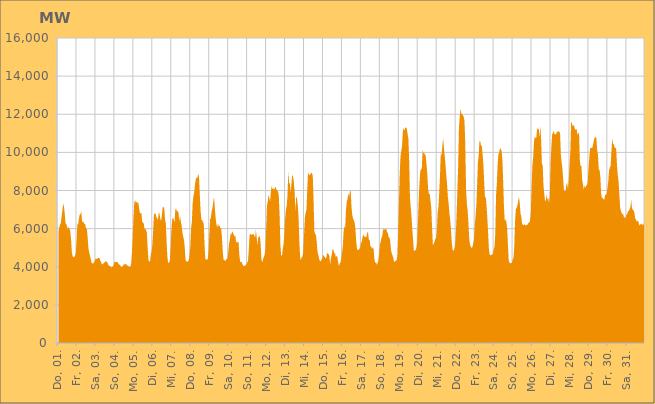
| Category | Series 0 |
|---|---|
|  Do, 01.  | 5819.141 |
|  Do, 01.  | 6049.581 |
|  Do, 01.  | 6199.943 |
|  Do, 01.  | 6284.422 |
|  Do, 01.  | 6601.119 |
|  Do, 01.  | 6928.238 |
|  Do, 01.  | 7310.073 |
|  Do, 01.  | 7171.679 |
|  Do, 01.  | 6812.417 |
|  Do, 01.  | 6271.698 |
|  Do, 01.  | 6247.18 |
|  Do, 01.  | 6112.427 |
|  Do, 01.  | 5953.786 |
|  Do, 01.  | 6097.898 |
|  Do, 01.  | 5997.28 |
|  Do, 01.  | 5862.135 |
|  Do, 01.  | 5456.843 |
|  Fr, 02.  | 4765.099 |
|  Fr, 02.  | 4569.053 |
|  Fr, 02.  | 4491.443 |
|  Fr, 02.  | 4515.205 |
|  Fr, 02.  | 4572.981 |
|  Fr, 02.  | 4697.592 |
|  Fr, 02.  | 5350.879 |
|  Fr, 02.  | 6231.528 |
|  Fr, 02.  | 6216.547 |
|  Fr, 02.  | 6530.846 |
|  Fr, 02.  | 6744.199 |
|  Fr, 02.  | 6755.091 |
|  Fr, 02.  | 6926.41 |
|  Fr, 02.  | 6336.916 |
|  Fr, 02.  | 6390.28 |
|  Fr, 02.  | 6328.69 |
|  Fr, 02.  | 6253.704 |
|  Fr, 02.  | 6226.253 |
|  Fr, 02.  | 5995.545 |
|  Fr, 02.  | 6007.529 |
|  Fr, 02.  | 5546.606 |
|  Fr, 02.  | 4977.057 |
|  Fr, 02.  | 4747.986 |
|  Fr, 02.  | 4575.123 |
|  Sa, 03.  | 4416.955 |
|  Sa, 03.  | 4207.178 |
|  Sa, 03.  | 4182.391 |
|  Sa, 03.  | 4170.869 |
|  Sa, 03.  | 4225.471 |
|  Sa, 03.  | 4305.148 |
|  Sa, 03.  | 4427.548 |
|  Sa, 03.  | 4406.7 |
|  Sa, 03.  | 4422.26 |
|  Sa, 03.  | 4448.501 |
|  Sa, 03.  | 4472.187 |
|  Sa, 03.  | 4457.336 |
|  Sa, 03.  | 4332.002 |
|  Sa, 03.  | 4228.605 |
|  Sa, 03.  | 4135.831 |
|  Sa, 03.  | 4130.716 |
|  Sa, 03.  | 4177.757 |
|  Sa, 03.  | 4219.109 |
|  Sa, 03.  | 4242.172 |
|  Sa, 03.  | 4301.738 |
|  Sa, 03.  | 4260.028 |
|  Sa, 03.  | 4221.406 |
|  Sa, 03.  | 4116.581 |
|  Sa, 03.  | 4052.291 |
|  So, 04.  | 4043.021 |
|  So, 04.  | 4012.192 |
|  So, 04.  | 3961.959 |
|  So, 04.  | 4003.036 |
|  So, 04.  | 4000.279 |
|  So, 04.  | 4105.423 |
|  So, 04.  | 4258.826 |
|  So, 04.  | 4254.578 |
|  So, 04.  | 4249.414 |
|  So, 04.  | 4243.981 |
|  So, 04.  | 4236.702 |
|  So, 04.  | 4170.789 |
|  So, 04.  | 4105.595 |
|  So, 04.  | 4092.778 |
|  So, 04.  | 4024.175 |
|  So, 04.  | 3966.239 |
|  So, 04.  | 3992.375 |
|  So, 04.  | 4076.674 |
|  So, 04.  | 4134.921 |
|  So, 04.  | 4130.232 |
|  So, 04.  | 4137.612 |
|  So, 04.  | 4124.099 |
|  So, 04.  | 4073.206 |
|  So, 04.  | 4043.205 |
|  Mo, 05.  | 4009.803 |
|  Mo, 05.  | 3994.085 |
|  Mo, 05.  | 3990 |
|  Mo, 05.  | 4124.593 |
|  Mo, 05.  | 4672.149 |
|  Mo, 05.  | 5502.078 |
|  Mo, 05.  | 6567.981 |
|  Mo, 05.  | 7353.119 |
|  Mo, 05.  | 7507.601 |
|  Mo, 05.  | 7356.988 |
|  Mo, 05.  | 7405.1 |
|  Mo, 05.  | 7353.434 |
|  Mo, 05.  | 7387.624 |
|  Mo, 05.  | 7120.987 |
|  Mo, 05.  | 6846.015 |
|  Mo, 05.  | 6788.228 |
|  Mo, 05.  | 6840.34 |
|  Mo, 05.  | 6400.135 |
|  Mo, 05.  | 6304.479 |
|  Mo, 05.  | 6281.654 |
|  Mo, 05.  | 5971.389 |
|  Mo, 05.  | 5989.571 |
|  Mo, 05.  | 5923.716 |
|  Mo, 05.  | 5781.208 |
|  Di, 06.  | 4981.493 |
|  Di, 06.  | 4340.661 |
|  Di, 06.  | 4273.883 |
|  Di, 06.  | 4284.502 |
|  Di, 06.  | 4660.382 |
|  Di, 06.  | 4792.194 |
|  Di, 06.  | 5185.739 |
|  Di, 06.  | 5930.915 |
|  Di, 06.  | 6767.495 |
|  Di, 06.  | 6789.576 |
|  Di, 06.  | 6796.853 |
|  Di, 06.  | 6597.347 |
|  Di, 06.  | 6567.943 |
|  Di, 06.  | 6435.265 |
|  Di, 06.  | 6859.311 |
|  Di, 06.  | 6781.747 |
|  Di, 06.  | 6509.067 |
|  Di, 06.  | 6403.526 |
|  Di, 06.  | 6720.576 |
|  Di, 06.  | 7115.715 |
|  Di, 06.  | 7135.378 |
|  Di, 06.  | 7084.986 |
|  Di, 06.  | 6467.995 |
|  Di, 06.  | 6256.748 |
|  Mi, 07.  | 5274.378 |
|  Mi, 07.  | 4490.783 |
|  Mi, 07.  | 4184.538 |
|  Mi, 07.  | 4231.614 |
|  Mi, 07.  | 4302.615 |
|  Mi, 07.  | 4925.245 |
|  Mi, 07.  | 5874.045 |
|  Mi, 07.  | 6455.452 |
|  Mi, 07.  | 6572.512 |
|  Mi, 07.  | 6491.152 |
|  Mi, 07.  | 6319.095 |
|  Mi, 07.  | 7000.752 |
|  Mi, 07.  | 7057.197 |
|  Mi, 07.  | 6898.097 |
|  Mi, 07.  | 6928.825 |
|  Mi, 07.  | 6854.577 |
|  Mi, 07.  | 6386.952 |
|  Mi, 07.  | 6684.011 |
|  Mi, 07.  | 6360.383 |
|  Mi, 07.  | 6155.014 |
|  Mi, 07.  | 5764.43 |
|  Mi, 07.  | 5580.781 |
|  Mi, 07.  | 5397.548 |
|  Mi, 07.  | 4971.411 |
|  Do, 08.  | 4344.342 |
|  Do, 08.  | 4290.657 |
|  Do, 08.  | 4258.361 |
|  Do, 08.  | 4273.055 |
|  Do, 08.  | 4362.325 |
|  Do, 08.  | 4613.191 |
|  Do, 08.  | 5050.746 |
|  Do, 08.  | 6019.938 |
|  Do, 08.  | 6392.769 |
|  Do, 08.  | 7377.638 |
|  Do, 08.  | 7716.869 |
|  Do, 08.  | 7925.282 |
|  Do, 08.  | 8348.684 |
|  Do, 08.  | 8624.167 |
|  Do, 08.  | 8665.847 |
|  Do, 08.  | 8667.424 |
|  Do, 08.  | 8880.255 |
|  Do, 08.  | 8719.814 |
|  Do, 08.  | 7769.586 |
|  Do, 08.  | 6917.651 |
|  Do, 08.  | 6474.374 |
|  Do, 08.  | 6457.414 |
|  Do, 08.  | 6330.388 |
|  Do, 08.  | 6267.978 |
|  Fr, 09.  | 5158.726 |
|  Fr, 09.  | 4394.491 |
|  Fr, 09.  | 4394.445 |
|  Fr, 09.  | 4366.35 |
|  Fr, 09.  | 4400.658 |
|  Fr, 09.  | 4783.771 |
|  Fr, 09.  | 5698.116 |
|  Fr, 09.  | 6492.231 |
|  Fr, 09.  | 6574.202 |
|  Fr, 09.  | 6923.601 |
|  Fr, 09.  | 7080.836 |
|  Fr, 09.  | 7397.887 |
|  Fr, 09.  | 7650.66 |
|  Fr, 09.  | 7094.256 |
|  Fr, 09.  | 6582.305 |
|  Fr, 09.  | 6217.221 |
|  Fr, 09.  | 6063.734 |
|  Fr, 09.  | 6276.399 |
|  Fr, 09.  | 6115.25 |
|  Fr, 09.  | 6164.515 |
|  Fr, 09.  | 6019.487 |
|  Fr, 09.  | 6012.042 |
|  Fr, 09.  | 5565.05 |
|  Fr, 09.  | 4813.559 |
|  Sa, 10.  | 4377.041 |
|  Sa, 10.  | 4356.76 |
|  Sa, 10.  | 4282.141 |
|  Sa, 10.  | 4375.646 |
|  Sa, 10.  | 4400.217 |
|  Sa, 10.  | 4430.862 |
|  Sa, 10.  | 4746.945 |
|  Sa, 10.  | 5215.407 |
|  Sa, 10.  | 5411.37 |
|  Sa, 10.  | 5739.468 |
|  Sa, 10.  | 5694.139 |
|  Sa, 10.  | 5871.995 |
|  Sa, 10.  | 5791.142 |
|  Sa, 10.  | 5674.396 |
|  Sa, 10.  | 5594.255 |
|  Sa, 10.  | 5625.737 |
|  Sa, 10.  | 5287.979 |
|  Sa, 10.  | 5287.943 |
|  Sa, 10.  | 5275.386 |
|  Sa, 10.  | 5336.485 |
|  Sa, 10.  | 4631.694 |
|  Sa, 10.  | 4278.8 |
|  Sa, 10.  | 4237.284 |
|  Sa, 10.  | 4256.599 |
|  So, 11.  | 4132.123 |
|  So, 11.  | 4046.798 |
|  So, 11.  | 4034.5 |
|  So, 11.  | 4054.717 |
|  So, 11.  | 4095.89 |
|  So, 11.  | 4127.878 |
|  So, 11.  | 4228.712 |
|  So, 11.  | 4293.339 |
|  So, 11.  | 4909.6 |
|  So, 11.  | 5674.549 |
|  So, 11.  | 5731.817 |
|  So, 11.  | 5660.123 |
|  So, 11.  | 5715.679 |
|  So, 11.  | 5674.69 |
|  So, 11.  | 5743.94 |
|  So, 11.  | 5625.126 |
|  So, 11.  | 5538.325 |
|  So, 11.  | 5937.469 |
|  So, 11.  | 5544.269 |
|  So, 11.  | 5115.922 |
|  So, 11.  | 5568.529 |
|  So, 11.  | 5562.46 |
|  So, 11.  | 5624.695 |
|  So, 11.  | 5184.215 |
|  Mo, 12.  | 4398.085 |
|  Mo, 12.  | 4215.078 |
|  Mo, 12.  | 4386.085 |
|  Mo, 12.  | 4519.636 |
|  Mo, 12.  | 4623.58 |
|  Mo, 12.  | 4918.687 |
|  Mo, 12.  | 6005.484 |
|  Mo, 12.  | 7230.165 |
|  Mo, 12.  | 7406.25 |
|  Mo, 12.  | 7787.454 |
|  Mo, 12.  | 7596.823 |
|  Mo, 12.  | 7447.525 |
|  Mo, 12.  | 7958.235 |
|  Mo, 12.  | 8244.315 |
|  Mo, 12.  | 8076.059 |
|  Mo, 12.  | 8113.631 |
|  Mo, 12.  | 8042.094 |
|  Mo, 12.  | 8144.004 |
|  Mo, 12.  | 8194.055 |
|  Mo, 12.  | 8046.491 |
|  Mo, 12.  | 7988.898 |
|  Mo, 12.  | 7955.942 |
|  Mo, 12.  | 7716.954 |
|  Mo, 12.  | 6682.778 |
|  Di, 13.  | 5128.643 |
|  Di, 13.  | 4575.871 |
|  Di, 13.  | 4586.709 |
|  Di, 13.  | 4922.741 |
|  Di, 13.  | 5174.917 |
|  Di, 13.  | 5720.804 |
|  Di, 13.  | 6537.373 |
|  Di, 13.  | 7005.615 |
|  Di, 13.  | 7203.378 |
|  Di, 13.  | 7748.247 |
|  Di, 13.  | 9023.951 |
|  Di, 13.  | 8379.961 |
|  Di, 13.  | 8376.179 |
|  Di, 13.  | 7895.748 |
|  Di, 13.  | 8372.445 |
|  Di, 13.  | 8849.748 |
|  Di, 13.  | 8703.319 |
|  Di, 13.  | 8476.318 |
|  Di, 13.  | 7923.398 |
|  Di, 13.  | 6945.578 |
|  Di, 13.  | 7682.053 |
|  Di, 13.  | 7614.243 |
|  Di, 13.  | 7212.952 |
|  Di, 13.  | 6572.593 |
|  Mi, 14.  | 5321.272 |
|  Mi, 14.  | 4465.437 |
|  Mi, 14.  | 4349.225 |
|  Mi, 14.  | 4503.236 |
|  Mi, 14.  | 4534.243 |
|  Mi, 14.  | 4816.619 |
|  Mi, 14.  | 5742.049 |
|  Mi, 14.  | 6588.894 |
|  Mi, 14.  | 6850.891 |
|  Mi, 14.  | 6980.627 |
|  Mi, 14.  | 8018.416 |
|  Mi, 14.  | 8966.478 |
|  Mi, 14.  | 8840.652 |
|  Mi, 14.  | 8804.521 |
|  Mi, 14.  | 8854.285 |
|  Mi, 14.  | 8925.498 |
|  Mi, 14.  | 8911.268 |
|  Mi, 14.  | 8749.073 |
|  Mi, 14.  | 7505.273 |
|  Mi, 14.  | 5857.93 |
|  Mi, 14.  | 5716.411 |
|  Mi, 14.  | 5684.02 |
|  Mi, 14.  | 5301.143 |
|  Mi, 14.  | 4773.79 |
|  Do, 15.  | 4624.807 |
|  Do, 15.  | 4425.9 |
|  Do, 15.  | 4304.242 |
|  Do, 15.  | 4272.598 |
|  Do, 15.  | 4368.536 |
|  Do, 15.  | 4445.17 |
|  Do, 15.  | 4617.123 |
|  Do, 15.  | 4576.704 |
|  Do, 15.  | 4521.386 |
|  Do, 15.  | 4449.854 |
|  Do, 15.  | 4451.665 |
|  Do, 15.  | 4725.438 |
|  Do, 15.  | 4689.201 |
|  Do, 15.  | 4666.343 |
|  Do, 15.  | 4560.54 |
|  Do, 15.  | 4102.442 |
|  Do, 15.  | 4458.514 |
|  Do, 15.  | 4633.226 |
|  Do, 15.  | 4933.095 |
|  Do, 15.  | 4909.585 |
|  Do, 15.  | 4688.104 |
|  Do, 15.  | 4742.915 |
|  Do, 15.  | 4523.153 |
|  Do, 15.  | 4555.083 |
|  Fr, 16.  | 4550.869 |
|  Fr, 16.  | 4258.304 |
|  Fr, 16.  | 4037.856 |
|  Fr, 16.  | 4144.346 |
|  Fr, 16.  | 4226.879 |
|  Fr, 16.  | 4380.082 |
|  Fr, 16.  | 4734.866 |
|  Fr, 16.  | 5067.545 |
|  Fr, 16.  | 5840.313 |
|  Fr, 16.  | 6130.46 |
|  Fr, 16.  | 6042.471 |
|  Fr, 16.  | 6967.735 |
|  Fr, 16.  | 7400.539 |
|  Fr, 16.  | 7562.059 |
|  Fr, 16.  | 7879.15 |
|  Fr, 16.  | 7651.771 |
|  Fr, 16.  | 7953.217 |
|  Fr, 16.  | 8001.29 |
|  Fr, 16.  | 7126.186 |
|  Fr, 16.  | 6702.219 |
|  Fr, 16.  | 6526.331 |
|  Fr, 16.  | 6446.273 |
|  Fr, 16.  | 6317.63 |
|  Fr, 16.  | 5959.267 |
|  Sa, 17.  | 5304.237 |
|  Sa, 17.  | 4932.077 |
|  Sa, 17.  | 4865.019 |
|  Sa, 17.  | 4903.03 |
|  Sa, 17.  | 4925.625 |
|  Sa, 17.  | 5015.328 |
|  Sa, 17.  | 5259.592 |
|  Sa, 17.  | 5298.661 |
|  Sa, 17.  | 5549.337 |
|  Sa, 17.  | 5692.369 |
|  Sa, 17.  | 5615.46 |
|  Sa, 17.  | 5555.489 |
|  Sa, 17.  | 5556.432 |
|  Sa, 17.  | 5577.297 |
|  Sa, 17.  | 5817.996 |
|  Sa, 17.  | 5770.992 |
|  Sa, 17.  | 5411.502 |
|  Sa, 17.  | 5406.847 |
|  Sa, 17.  | 5061.501 |
|  Sa, 17.  | 5062.371 |
|  Sa, 17.  | 4933.069 |
|  Sa, 17.  | 5013.734 |
|  Sa, 17.  | 4922.491 |
|  Sa, 17.  | 4390.129 |
|  So, 18.  | 4181.544 |
|  So, 18.  | 4265.428 |
|  So, 18.  | 4090.869 |
|  So, 18.  | 4178.82 |
|  So, 18.  | 4355.108 |
|  So, 18.  | 4762.888 |
|  So, 18.  | 5170.962 |
|  So, 18.  | 5334.096 |
|  So, 18.  | 5525.639 |
|  So, 18.  | 5622.321 |
|  So, 18.  | 6022.278 |
|  So, 18.  | 5890.568 |
|  So, 18.  | 6000.067 |
|  So, 18.  | 5941.092 |
|  So, 18.  | 6002.792 |
|  So, 18.  | 5811.667 |
|  So, 18.  | 5775.399 |
|  So, 18.  | 5557.018 |
|  So, 18.  | 5526.554 |
|  So, 18.  | 5368.208 |
|  So, 18.  | 4866.946 |
|  So, 18.  | 4705.637 |
|  So, 18.  | 4591.328 |
|  So, 18.  | 4444.331 |
|  Mo, 19.  | 4229.289 |
|  Mo, 19.  | 4293.785 |
|  Mo, 19.  | 4311.774 |
|  Mo, 19.  | 4344.178 |
|  Mo, 19.  | 4563.698 |
|  Mo, 19.  | 5672.177 |
|  Mo, 19.  | 7286.791 |
|  Mo, 19.  | 8858.912 |
|  Mo, 19.  | 9777.335 |
|  Mo, 19.  | 10074.733 |
|  Mo, 19.  | 10340.269 |
|  Mo, 19.  | 11074.767 |
|  Mo, 19.  | 11284.835 |
|  Mo, 19.  | 11135.178 |
|  Mo, 19.  | 11301.953 |
|  Mo, 19.  | 11300.208 |
|  Mo, 19.  | 11243.537 |
|  Mo, 19.  | 10960.357 |
|  Mo, 19.  | 10712.435 |
|  Mo, 19.  | 9539.702 |
|  Mo, 19.  | 7629.35 |
|  Mo, 19.  | 7109.524 |
|  Mo, 19.  | 6632.759 |
|  Mo, 19.  | 5932.255 |
|  Di, 20.  | 5391.639 |
|  Di, 20.  | 4804.621 |
|  Di, 20.  | 4864.112 |
|  Di, 20.  | 4870.182 |
|  Di, 20.  | 4958.649 |
|  Di, 20.  | 5263.379 |
|  Di, 20.  | 6226.046 |
|  Di, 20.  | 7409.073 |
|  Di, 20.  | 8350.909 |
|  Di, 20.  | 8984.758 |
|  Di, 20.  | 9128.077 |
|  Di, 20.  | 9118.414 |
|  Di, 20.  | 10128.545 |
|  Di, 20.  | 9965.97 |
|  Di, 20.  | 9973.12 |
|  Di, 20.  | 9871.118 |
|  Di, 20.  | 9823.425 |
|  Di, 20.  | 9319.02 |
|  Di, 20.  | 8820.052 |
|  Di, 20.  | 8076.497 |
|  Di, 20.  | 7816.201 |
|  Di, 20.  | 7813.045 |
|  Di, 20.  | 7452.865 |
|  Di, 20.  | 7080.513 |
|  Mi, 21.  | 6050.314 |
|  Mi, 21.  | 5156.017 |
|  Mi, 21.  | 5191.828 |
|  Mi, 21.  | 5308.691 |
|  Mi, 21.  | 5449.154 |
|  Mi, 21.  | 5501.984 |
|  Mi, 21.  | 5870.508 |
|  Mi, 21.  | 6821.372 |
|  Mi, 21.  | 7140.753 |
|  Mi, 21.  | 7866.495 |
|  Mi, 21.  | 8752.124 |
|  Mi, 21.  | 9977.32 |
|  Mi, 21.  | 9816.13 |
|  Mi, 21.  | 10376.496 |
|  Mi, 21.  | 10731.943 |
|  Mi, 21.  | 10201.96 |
|  Mi, 21.  | 9810.623 |
|  Mi, 21.  | 9334.156 |
|  Mi, 21.  | 8797.346 |
|  Mi, 21.  | 8295.818 |
|  Mi, 21.  | 7643.112 |
|  Mi, 21.  | 7293.924 |
|  Mi, 21.  | 6767.3 |
|  Mi, 21.  | 6427.398 |
|  Do, 22.  | 5872.936 |
|  Do, 22.  | 5212.077 |
|  Do, 22.  | 4904.157 |
|  Do, 22.  | 4825.4 |
|  Do, 22.  | 4916.793 |
|  Do, 22.  | 5076.95 |
|  Do, 22.  | 5703.97 |
|  Do, 22.  | 6700.606 |
|  Do, 22.  | 8009.1 |
|  Do, 22.  | 9262.704 |
|  Do, 22.  | 11288.138 |
|  Do, 22.  | 11880.421 |
|  Do, 22.  | 12306.896 |
|  Do, 22.  | 12023.508 |
|  Do, 22.  | 12009.155 |
|  Do, 22.  | 11946.304 |
|  Do, 22.  | 11868.772 |
|  Do, 22.  | 11663.959 |
|  Do, 22.  | 10469.576 |
|  Do, 22.  | 8096.97 |
|  Do, 22.  | 7318.853 |
|  Do, 22.  | 6961.836 |
|  Do, 22.  | 6306.757 |
|  Do, 22.  | 5477.625 |
|  Fr, 23.  | 5153.917 |
|  Fr, 23.  | 5046.126 |
|  Fr, 23.  | 4978.04 |
|  Fr, 23.  | 5028.584 |
|  Fr, 23.  | 5210.661 |
|  Fr, 23.  | 5407.052 |
|  Fr, 23.  | 6195.288 |
|  Fr, 23.  | 6633.735 |
|  Fr, 23.  | 7220.921 |
|  Fr, 23.  | 8270.108 |
|  Fr, 23.  | 9475.841 |
|  Fr, 23.  | 9854.735 |
|  Fr, 23.  | 10613.255 |
|  Fr, 23.  | 10582.283 |
|  Fr, 23.  | 10328.311 |
|  Fr, 23.  | 10360.778 |
|  Fr, 23.  | 9856.218 |
|  Fr, 23.  | 9343.736 |
|  Fr, 23.  | 8372.88 |
|  Fr, 23.  | 7585.684 |
|  Fr, 23.  | 7684.073 |
|  Fr, 23.  | 7144.773 |
|  Fr, 23.  | 6515.295 |
|  Fr, 23.  | 5702.456 |
|  Sa, 24.  | 4870.47 |
|  Sa, 24.  | 4626.441 |
|  Sa, 24.  | 4601.539 |
|  Sa, 24.  | 4640.246 |
|  Sa, 24.  | 4619.931 |
|  Sa, 24.  | 4678.975 |
|  Sa, 24.  | 4894.121 |
|  Sa, 24.  | 5064.512 |
|  Sa, 24.  | 5720.242 |
|  Sa, 24.  | 7766.888 |
|  Sa, 24.  | 8382.064 |
|  Sa, 24.  | 9398.582 |
|  Sa, 24.  | 9912.45 |
|  Sa, 24.  | 9999.375 |
|  Sa, 24.  | 10227.94 |
|  Sa, 24.  | 10167.34 |
|  Sa, 24.  | 10073.312 |
|  Sa, 24.  | 9575.516 |
|  Sa, 24.  | 8471.568 |
|  Sa, 24.  | 7108.11 |
|  Sa, 24.  | 6388.881 |
|  Sa, 24.  | 6486.617 |
|  Sa, 24.  | 6362.275 |
|  Sa, 24.  | 6016.201 |
|  So, 25.  | 5179.42 |
|  So, 25.  | 4311.865 |
|  So, 25.  | 4228.35 |
|  So, 25.  | 4163.506 |
|  So, 25.  | 4200.233 |
|  So, 25.  | 4202.214 |
|  So, 25.  | 4386.451 |
|  So, 25.  | 4454.118 |
|  So, 25.  | 4997.478 |
|  So, 25.  | 6370.416 |
|  So, 25.  | 7015.998 |
|  So, 25.  | 7098.252 |
|  So, 25.  | 7224.534 |
|  So, 25.  | 7445.681 |
|  So, 25.  | 7664.853 |
|  So, 25.  | 7322.982 |
|  So, 25.  | 6786.267 |
|  So, 25.  | 6589.024 |
|  So, 25.  | 6247.148 |
|  So, 25.  | 6191.829 |
|  So, 25.  | 6190.627 |
|  So, 25.  | 6242.986 |
|  So, 25.  | 6149.699 |
|  So, 25.  | 6190.958 |
|  Mo, 26.  | 6203.061 |
|  Mo, 26.  | 6211.413 |
|  Mo, 26.  | 6305.118 |
|  Mo, 26.  | 6323.059 |
|  Mo, 26.  | 6427.803 |
|  Mo, 26.  | 6835.001 |
|  Mo, 26.  | 8251.238 |
|  Mo, 26.  | 9355.265 |
|  Mo, 26.  | 9739.829 |
|  Mo, 26.  | 10554.593 |
|  Mo, 26.  | 10843.739 |
|  Mo, 26.  | 10748.02 |
|  Mo, 26.  | 10799.296 |
|  Mo, 26.  | 11281.445 |
|  Mo, 26.  | 11193.258 |
|  Mo, 26.  | 11267.693 |
|  Mo, 26.  | 10772.985 |
|  Mo, 26.  | 11383.127 |
|  Mo, 26.  | 10734.772 |
|  Mo, 26.  | 9389.028 |
|  Mo, 26.  | 9322.767 |
|  Mo, 26.  | 8248.38 |
|  Mo, 26.  | 7824.221 |
|  Mo, 26.  | 7428.796 |
|  Di, 27.  | 7494.807 |
|  Di, 27.  | 7781.285 |
|  Di, 27.  | 7524.741 |
|  Di, 27.  | 7602.313 |
|  Di, 27.  | 7345.362 |
|  Di, 27.  | 7728.389 |
|  Di, 27.  | 9451.238 |
|  Di, 27.  | 10324.695 |
|  Di, 27.  | 10930.56 |
|  Di, 27.  | 11043.14 |
|  Di, 27.  | 11113.985 |
|  Di, 27.  | 10943.502 |
|  Di, 27.  | 10963.952 |
|  Di, 27.  | 10936.022 |
|  Di, 27.  | 11092.257 |
|  Di, 27.  | 11066.367 |
|  Di, 27.  | 11125.915 |
|  Di, 27.  | 11066.654 |
|  Di, 27.  | 11012.29 |
|  Di, 27.  | 9879.348 |
|  Di, 27.  | 9472.75 |
|  Di, 27.  | 9143.843 |
|  Di, 27.  | 8528.587 |
|  Di, 27.  | 7988.088 |
|  Mi, 28.  | 7975.942 |
|  Mi, 28.  | 7973.037 |
|  Mi, 28.  | 8301.224 |
|  Mi, 28.  | 8403.738 |
|  Mi, 28.  | 8063.556 |
|  Mi, 28.  | 8586.652 |
|  Mi, 28.  | 9366.754 |
|  Mi, 28.  | 10022.184 |
|  Mi, 28.  | 11591.411 |
|  Mi, 28.  | 11537.2 |
|  Mi, 28.  | 11369.596 |
|  Mi, 28.  | 11430.843 |
|  Mi, 28.  | 11378.232 |
|  Mi, 28.  | 11180.245 |
|  Mi, 28.  | 11214.032 |
|  Mi, 28.  | 11214.361 |
|  Mi, 28.  | 10902.832 |
|  Mi, 28.  | 11016.655 |
|  Mi, 28.  | 11021.93 |
|  Mi, 28.  | 9593.167 |
|  Mi, 28.  | 9287.732 |
|  Mi, 28.  | 9283.479 |
|  Mi, 28.  | 8526.804 |
|  Mi, 28.  | 8336.612 |
|  Do, 29.  | 8032.524 |
|  Do, 29.  | 8273.226 |
|  Do, 29.  | 8134.421 |
|  Do, 29.  | 8267.2 |
|  Do, 29.  | 8284.197 |
|  Do, 29.  | 8425.631 |
|  Do, 29.  | 9123.845 |
|  Do, 29.  | 9745.586 |
|  Do, 29.  | 10202.76 |
|  Do, 29.  | 10250.306 |
|  Do, 29.  | 10225.091 |
|  Do, 29.  | 10263.363 |
|  Do, 29.  | 10476.393 |
|  Do, 29.  | 10683.083 |
|  Do, 29.  | 10783.715 |
|  Do, 29.  | 10814.539 |
|  Do, 29.  | 10724.733 |
|  Do, 29.  | 10096.614 |
|  Do, 29.  | 9869.232 |
|  Do, 29.  | 9088.667 |
|  Do, 29.  | 9082.626 |
|  Do, 29.  | 8692.047 |
|  Do, 29.  | 7833.12 |
|  Do, 29.  | 7612.844 |
|  Fr, 30.  | 7599.292 |
|  Fr, 30.  | 7541.499 |
|  Fr, 30.  | 7521.508 |
|  Fr, 30.  | 7769.494 |
|  Fr, 30.  | 7779.189 |
|  Fr, 30.  | 7816.112 |
|  Fr, 30.  | 8145.453 |
|  Fr, 30.  | 8469.549 |
|  Fr, 30.  | 9061.351 |
|  Fr, 30.  | 9194.26 |
|  Fr, 30.  | 9300.004 |
|  Fr, 30.  | 10041.99 |
|  Fr, 30.  | 10730.633 |
|  Fr, 30.  | 10459.12 |
|  Fr, 30.  | 10410.625 |
|  Fr, 30.  | 10259.597 |
|  Fr, 30.  | 10243.497 |
|  Fr, 30.  | 10193.645 |
|  Fr, 30.  | 9370.032 |
|  Fr, 30.  | 8821.896 |
|  Fr, 30.  | 8498.29 |
|  Fr, 30.  | 7779.022 |
|  Fr, 30.  | 7116.526 |
|  Fr, 30.  | 6936.602 |
|  Sa, 31.  | 6813.049 |
|  Sa, 31.  | 6750.313 |
|  Sa, 31.  | 6762.901 |
|  Sa, 31.  | 6561.115 |
|  Sa, 31.  | 6623.113 |
|  Sa, 31.  | 6532.67 |
|  Sa, 31.  | 6742.769 |
|  Sa, 31.  | 6768.884 |
|  Sa, 31.  | 6918.684 |
|  Sa, 31.  | 6926.824 |
|  Sa, 31.  | 7028.105 |
|  Sa, 31.  | 7117.53 |
|  Sa, 31.  | 7524.257 |
|  Sa, 31.  | 7074.958 |
|  Sa, 31.  | 6992.147 |
|  Sa, 31.  | 6953.634 |
|  Sa, 31.  | 6839.666 |
|  Sa, 31.  | 6562.909 |
|  Sa, 31.  | 6469.166 |
|  Sa, 31.  | 6370.761 |
|  Sa, 31.  | 6421.055 |
|  Sa, 31.  | 6375.641 |
|  Sa, 31.  | 6213.907 |
|  Sa, 31.  | 6162.515 |
|  So, 01.  | 6241.768 |
|  So, 01.  | 6264.526 |
|  So, 01.  | 6201.005 |
|  So, 01.  | 6200.064 |
|  So, 01.  | 6233.952 |
|  So, 01.  | 6287.209 |